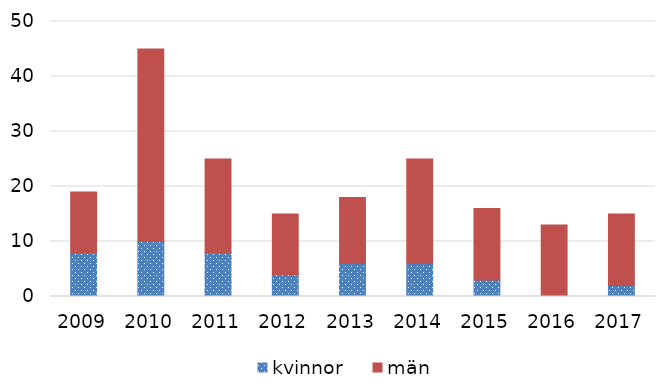
| Category | kvinnor | män |
|---|---|---|
| 2009 | 8 | 11 |
| 2010 | 10 | 35 |
| 2011 | 8 | 17 |
| 2012 | 4 | 11 |
| 2013 | 6 | 12 |
| 2014 | 6 | 19 |
| 2015 | 3 | 13 |
| 2016 | 0 | 13 |
| 2017 | 2 | 13 |